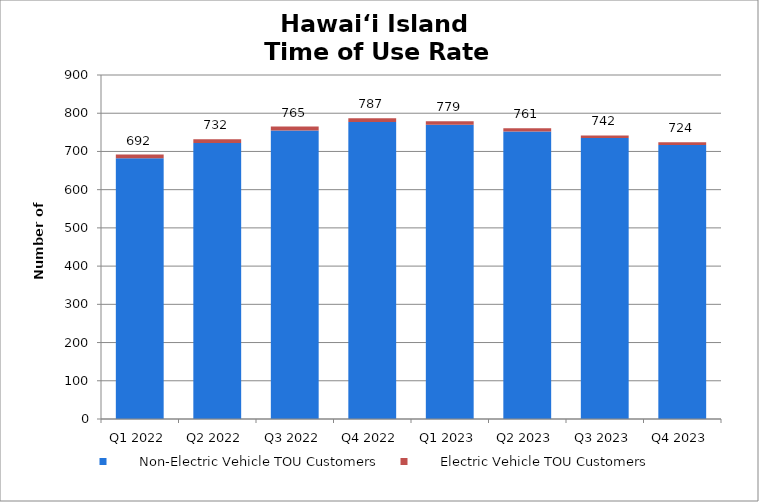
| Category |        Non-Electric Vehicle TOU Customers |        Electric Vehicle TOU Customers |
|---|---|---|
| Q1 2022 | 682 | 10 |
| Q2 2022 | 722 | 10 |
| Q3 2022 | 755 | 10 |
| Q4 2022 | 777 | 10 |
| Q1 2023 | 770 | 9 |
| Q2 2023 | 752 | 9 |
| Q3 2023 | 735 | 7 |
| Q4 2023 | 717 | 7 |